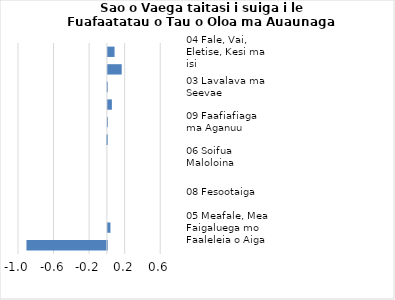
| Category |     Contributions |
|---|---|
| 04 Fale, Vai, Eletise, Kesi ma isi | 0.075 |
| 07 Femalagaiga | 0.156 |
| 03 Lavalava ma Seevae | -0.003 |
| 02 Ava Malosi ma Tapaa | 0.045 |
| 09 Faafiafiaga ma Aganuu | 0 |
| 12 Isi Oloa ma Auaunaga | -0.009 |
| 06 Soifua Maloloina | 0 |
| 10 Aoaoga | 0 |
| 08 Fesootaiga | 0 |
| 11 Faleaiga | 0 |
| 05 Meafale, Mea Faigaluega mo Faaleleia o Aiga | 0.029 |
| 01 Meaai ma Vaiinu | -0.905 |